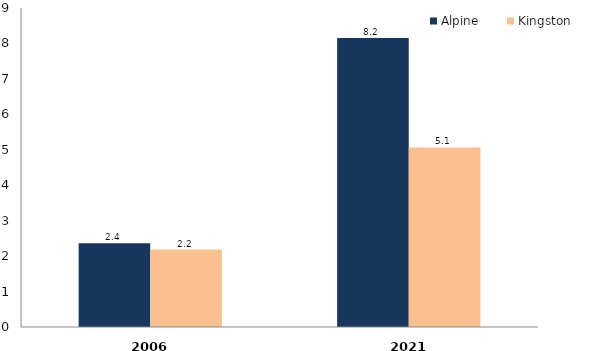
| Category | Alpine | Kingston |
|---|---|---|
| 2006.0 | 2.361 | 2.184 |
| 2021.0 | 8.155 | 5.068 |